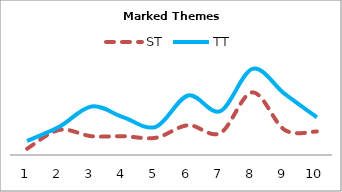
| Category | ST | TT |
|---|---|---|
| 0 | 4 | 9 |
| 1 | 16 | 18 |
| 2 | 12 | 31 |
| 3 | 12 | 24 |
| 4 | 11 | 18 |
| 5 | 19 | 38 |
| 6 | 14 | 28 |
| 7 | 40 | 55 |
| 8 | 16 | 39 |
| 9 | 15 | 24 |